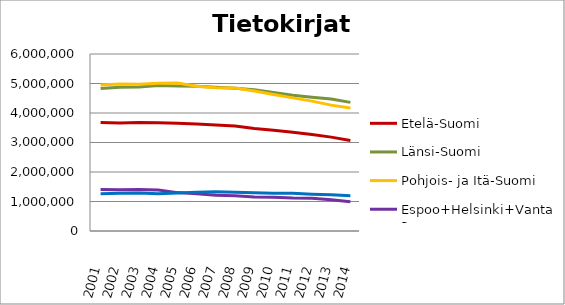
| Category | Etelä-Suomi | Länsi-Suomi | Pohjois- ja Itä-Suomi | Espoo+Helsinki+Vantaa | Muu Uusimaa |
|---|---|---|---|---|---|
| 2001.0 | 3676460 | 4832049 | 4947622 | 1406457 | 1265309 |
| 2002.0 | 3659607 | 4875067 | 4986126 | 1400852 | 1280005 |
| 2003.0 | 3676475 | 4882737 | 4977738 | 1409815 | 1291997 |
| 2004.0 | 3668223 | 4936086 | 5006347 | 1388015 | 1265415 |
| 2005.0 | 3651974 | 4911968 | 5018093 | 1301282 | 1287351 |
| 2006.0 | 3628780 | 4906048 | 4904008 | 1259844 | 1311059 |
| 2007.0 | 3595427 | 4875066 | 4857198 | 1213446 | 1326544 |
| 2008.0 | 3559230 | 4842752 | 4847204 | 1193059 | 1311449 |
| 2009.0 | 3476050 | 4785505 | 4744890 | 1155859 | 1300609 |
| 2010.0 | 3412616 | 4693319 | 4625817 | 1145204 | 1282506 |
| 2011.0 | 3345575 | 4601833 | 4513175 | 1117451 | 1278351 |
| 2012.0 | 3267550 | 4534604 | 4402161 | 1109735 | 1248859 |
| 2013.0 | 3182245 | 4473699 | 4266344 | 1059508 | 1227747 |
| 2014.0 | 3066023 | 4359532 | 4168913 | 990234 | 1198569 |